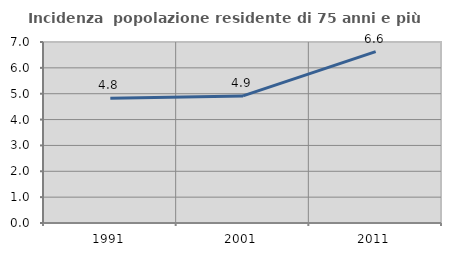
| Category | Incidenza  popolazione residente di 75 anni e più |
|---|---|
| 1991.0 | 4.825 |
| 2001.0 | 4.916 |
| 2011.0 | 6.625 |